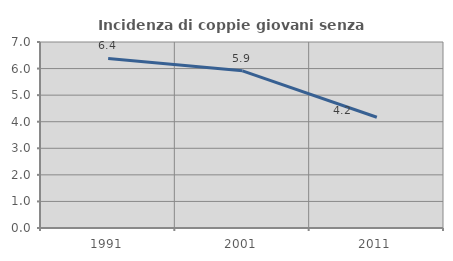
| Category | Incidenza di coppie giovani senza figli |
|---|---|
| 1991.0 | 6.383 |
| 2001.0 | 5.914 |
| 2011.0 | 4.167 |